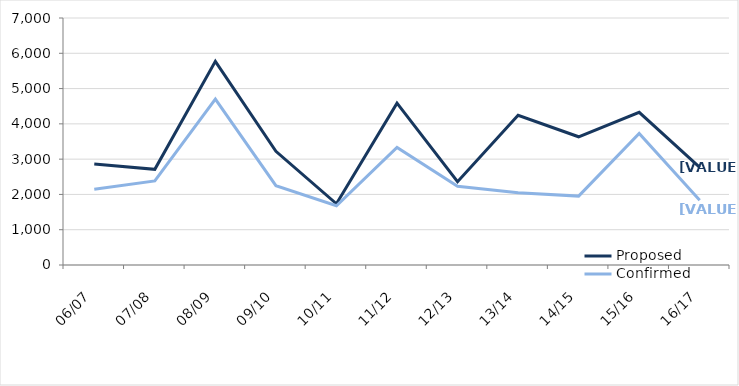
| Category | Proposed | Confirmed |
|---|---|---|
| 06/07 | 2864 | 2147 |
| 07/08 | 2712 | 2383 |
| 08/09 | 5771 | 4703 |
| 09/10 | 3223 | 2247 |
| 10/11 | 1734 | 1680 |
| 11/12 | 4586 | 3330 |
| 12/13 | 2360 | 2233 |
| 13/14 | 4242 | 2048 |
| 14/15 | 3634 | 1952 |
| 15/16 | 4326 | 3730 |
| 16/17 | 2764 | 1835 |